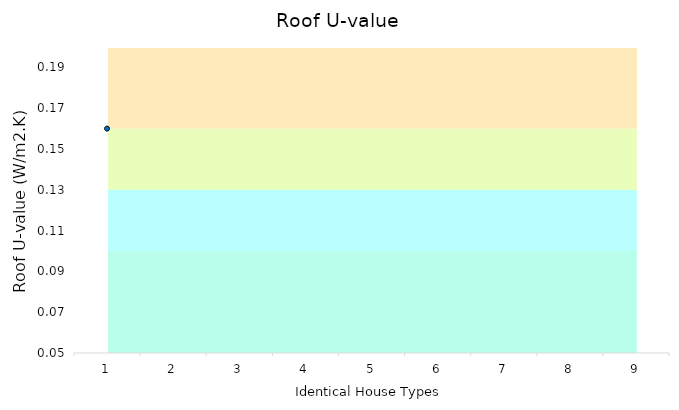
| Category | Series 0 | Series 1 | Series 2 | Series 3 |
|---|---|---|---|---|
| 0 | 0.1 | 0.03 | 0.03 | 0.04 |
| 1 | 0.1 | 0.03 | 0.03 | 0.04 |
| 2 | 0.1 | 0.03 | 0.03 | 0.04 |
| 3 | 0.1 | 0.03 | 0.03 | 0.04 |
| 4 | 0.1 | 0.03 | 0.03 | 0.04 |
| 5 | 0.1 | 0.03 | 0.03 | 0.04 |
| 6 | 0.1 | 0.03 | 0.03 | 0.04 |
| 7 | 0.1 | 0.03 | 0.03 | 0.04 |
| 8 | 0.1 | 0.03 | 0.03 | 0.04 |